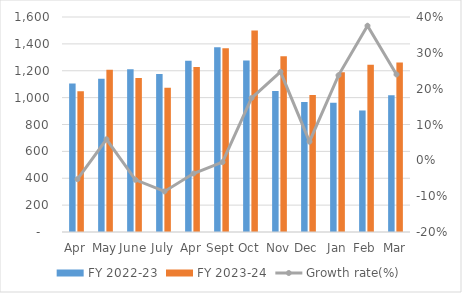
| Category | FY 2022-23 | FY 2023-24 |
|---|---|---|
| Apr | 1105 | 1047 |
| May | 1141 | 1208 |
| June | 1212 | 1146 |
| July | 1176 | 1074 |
| Apr | 1275 | 1228 |
| Sept | 1375 | 1368 |
| Oct | 1277 | 1499 |
| Nov | 1049 | 1308 |
| Dec | 968.37 | 1019 |
| Jan | 961 | 1189 |
| Feb | 904.358 | 1244 |
| Mar | 1018 | 1262 |